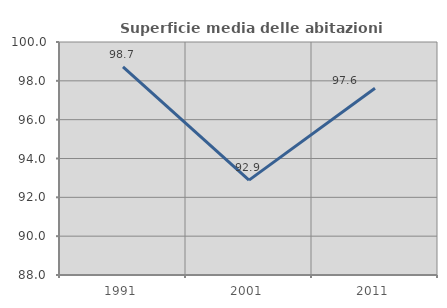
| Category | Superficie media delle abitazioni occupate |
|---|---|
| 1991.0 | 98.715 |
| 2001.0 | 92.887 |
| 2011.0 | 97.622 |